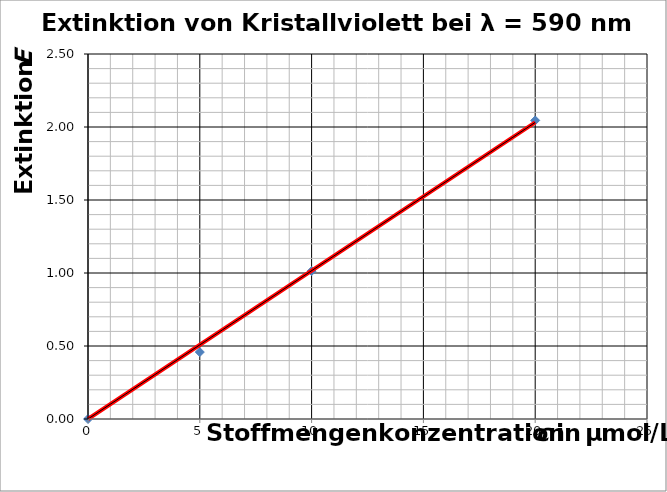
| Category | Extinktion |
|---|---|
| 0.0 | 0 |
| 5.0 | 0.458 |
| 10.0 | 1.013 |
| 20.0 | 2.045 |